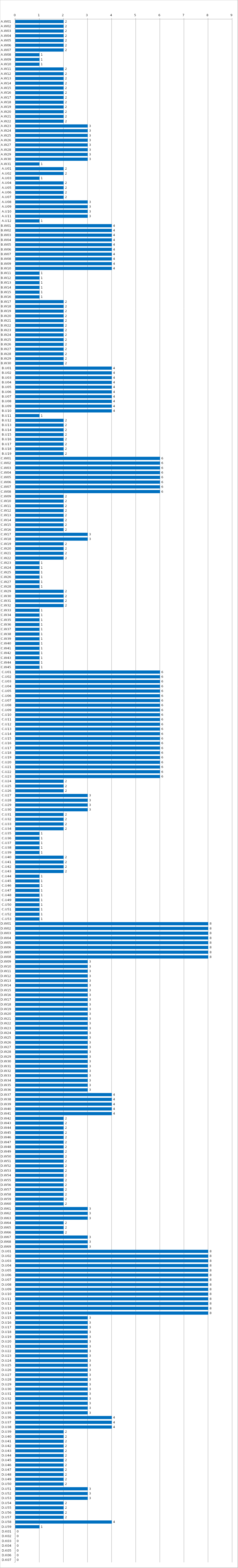
| Category | Series 0 |
|---|---|
| A.W01 | 2 |
| A.W02 | 2 |
| A.W03 | 2 |
| A.W04 | 2 |
| A.W05 | 2 |
| A.W06 | 2 |
| A.W07 | 2 |
| A.W08 | 1 |
| A.W09 | 1 |
| A.W10 | 1 |
| A.W11 | 2 |
| A.W12 | 2 |
| A.W13 | 2 |
| A.W14 | 2 |
| A.W15 | 2 |
| A.W16 | 2 |
| A.W17 | 2 |
| A.W18 | 2 |
| A.W19 | 2 |
| A.W20 | 2 |
| A.W21 | 2 |
| A.W22 | 2 |
| A.W23 | 3 |
| A.W24 | 3 |
| A.W25 | 3 |
| A.W26 | 3 |
| A.W27 | 3 |
| A.W28 | 3 |
| A.W29 | 3 |
| A.W30 | 3 |
| A.W31 | 1 |
| A.U01 | 2 |
| A.U02 | 2 |
| A.U03 | 1 |
| A.U04 | 2 |
| A.U05 | 2 |
| A.U06 | 2 |
| A.U07 | 2 |
| A.U08 | 3 |
| A.U09 | 3 |
| A.U10 | 3 |
| A.U11 | 3 |
| A.U12 | 1 |
| B.W01 | 4 |
| B.W02 | 4 |
| B.W03 | 4 |
| B.W04 | 4 |
| B.W05 | 4 |
| B.W06 | 4 |
| B.W07 | 4 |
| B.W08 | 4 |
| B.W09 | 4 |
| B.W10 | 4 |
| B.W11 | 1 |
| B.W12 | 1 |
| B.W13 | 1 |
| B.W14 | 1 |
| B.W15 | 1 |
| B.W16 | 1 |
| B.W17 | 2 |
| B.W18 | 2 |
| B.W19 | 2 |
| B.W20 | 2 |
| B.W21 | 2 |
| B.W22 | 2 |
| B.W23 | 2 |
| B.W24 | 2 |
| B.W25 | 2 |
| B.W26 | 2 |
| B.W27 | 2 |
| B.W28 | 2 |
| B.W29 | 2 |
| B.W30 | 2 |
| B.U01 | 4 |
| B.U02 | 4 |
| B.U03 | 4 |
| B.U04 | 4 |
| B.U05 | 4 |
| B.U06 | 4 |
| B.U07 | 4 |
| B.U08 | 4 |
| B.U09 | 4 |
| B.U10 | 4 |
| B.U11 | 1 |
| B.U12 | 2 |
| B.U13 | 2 |
| B.U14 | 2 |
| B.U15 | 2 |
| B.U16 | 2 |
| B.U17 | 2 |
| B.U18 | 2 |
| B.U19 | 2 |
| C.W01 | 6 |
| C.W02 | 6 |
| C.W03 | 6 |
| C.W04 | 6 |
| C.W05 | 6 |
| C.W06 | 6 |
| C.W07 | 6 |
| C.W08 | 6 |
| C.W09 | 2 |
| C.W10 | 2 |
| C.W11 | 2 |
| C.W12 | 2 |
| C.W13 | 2 |
| C.W14 | 2 |
| C.W15 | 2 |
| C.W16 | 2 |
| C.W17 | 3 |
| C.W18 | 3 |
| C.W19 | 2 |
| C.W20 | 2 |
| C.W21 | 2 |
| C.W22 | 2 |
| C.W23 | 1 |
| C.W24 | 1 |
| C.W25 | 1 |
| C.W26 | 1 |
| C.W27 | 1 |
| C.W28 | 1 |
| C.W29 | 2 |
| C.W30 | 2 |
| C.W31 | 2 |
| C.W32 | 2 |
| C.W33 | 1 |
| C.W34 | 1 |
| C.W35 | 1 |
| C.W36 | 1 |
| C.W37 | 1 |
| C.W38 | 1 |
| C.W39 | 1 |
| C.W40 | 1 |
| C.W41 | 1 |
| C.W42 | 1 |
| C.W43 | 1 |
| C.W44 | 1 |
| C.W45 | 1 |
| C.U01 | 6 |
| C.U02 | 6 |
| C.U03 | 6 |
| C.U04 | 6 |
| C.U05 | 6 |
| C.U06 | 6 |
| C.U07 | 6 |
| C.U08 | 6 |
| C.U09 | 6 |
| C.U10 | 6 |
| C.U11 | 6 |
| C.U12 | 6 |
| C.U13 | 6 |
| C.U14 | 6 |
| C.U15 | 6 |
| C.U16 | 6 |
| C.U17 | 6 |
| C.U18 | 6 |
| C.U19 | 6 |
| C.U20 | 6 |
| C.U21 | 6 |
| C.U22 | 6 |
| C.U23 | 6 |
| C.U24 | 2 |
| C.U25 | 2 |
| C.U26 | 2 |
| C.U27 | 3 |
| C.U28 | 3 |
| C.U29 | 3 |
| C.U30 | 3 |
| C.U31 | 2 |
| C.U32 | 2 |
| C.U33 | 2 |
| C.U34 | 2 |
| C.U35 | 1 |
| C.U36 | 1 |
| C.U37 | 1 |
| C.U38 | 1 |
| C.U39 | 1 |
| C.U40 | 2 |
| C.U41 | 2 |
| C.U42 | 2 |
| C.U43 | 2 |
| C.U44 | 1 |
| C.U45 | 1 |
| C.U46 | 1 |
| C.U47 | 1 |
| C.U48 | 1 |
| C.U49 | 1 |
| C.U50 | 1 |
| C.U51 | 1 |
| C.U52 | 1 |
| C.U53 | 1 |
| D.W01 | 8 |
| D.W02 | 8 |
| D.W03 | 8 |
| D.W04 | 8 |
| D.W05 | 8 |
| D.W06 | 8 |
| D.W07 | 8 |
| D.W08 | 8 |
| D.W09 | 3 |
| D.W10 | 3 |
| D.W11 | 3 |
| D.W12 | 3 |
| D.W13 | 3 |
| D.W14 | 3 |
| D.W15 | 3 |
| D.W16 | 3 |
| D.W17 | 3 |
| D.W18 | 3 |
| D.W19 | 3 |
| D.W20 | 3 |
| D.W21 | 3 |
| D.W22 | 3 |
| D.W23 | 3 |
| D.W24 | 3 |
| D.W25 | 3 |
| D.W26 | 3 |
| D.W27 | 3 |
| D.W28 | 3 |
| D.W29 | 3 |
| D.W30 | 3 |
| D.W31 | 3 |
| D.W32 | 3 |
| D.W33 | 3 |
| D.W34 | 3 |
| D.W35 | 3 |
| D.W36 | 3 |
| D.W37 | 4 |
| D.W38 | 4 |
| D.W39 | 4 |
| D.W40 | 4 |
| D.W41 | 4 |
| D.W42 | 2 |
| D.W43 | 2 |
| D.W44 | 2 |
| D.W45 | 2 |
| D.W46 | 2 |
| D.W47 | 2 |
| D.W48 | 2 |
| D.W49 | 2 |
| D.W50 | 2 |
| D.W51 | 2 |
| D.W52 | 2 |
| D.W53 | 2 |
| D.W54 | 2 |
| D.W55 | 2 |
| D.W56 | 2 |
| D.W57 | 2 |
| D.W58 | 2 |
| D.W59 | 2 |
| D.W60 | 2 |
| D.W61 | 3 |
| D.W62 | 3 |
| D.W63 | 3 |
| D.W64 | 2 |
| D.W65 | 2 |
| D.W66 | 2 |
| D.W67 | 3 |
| D.W68 | 3 |
| D.W69 | 3 |
| D.U01 | 8 |
| D.U02 | 8 |
| D.U03 | 8 |
| D.U04 | 8 |
| D.U05 | 8 |
| D.U06 | 8 |
| D.U07 | 8 |
| D.U08 | 8 |
| D.U09 | 8 |
| D.U10 | 8 |
| D.U11 | 8 |
| D.U12 | 8 |
| D.U13 | 8 |
| D.U14 | 8 |
| D.U15 | 3 |
| D.U16 | 3 |
| D.U17 | 3 |
| D.U18 | 3 |
| D.U19 | 3 |
| D.U20 | 3 |
| D.U21 | 3 |
| D.U22 | 3 |
| D.U23 | 3 |
| D.U24 | 3 |
| D.U25 | 3 |
| D.U26 | 3 |
| D.U27 | 3 |
| D.U28 | 3 |
| D.U29 | 3 |
| D.U30 | 3 |
| D.U31 | 3 |
| D.U32 | 3 |
| D.U33 | 3 |
| D.U34 | 3 |
| D.U35 | 3 |
| D.U36 | 4 |
| D.U37 | 4 |
| D.U38 | 4 |
| D.U39 | 2 |
| D.U40 | 2 |
| D.U41 | 2 |
| D.U42 | 2 |
| D.U43 | 2 |
| D.U44 | 2 |
| D.U45 | 2 |
| D.U46 | 2 |
| D.U47 | 2 |
| D.U48 | 2 |
| D.U49 | 2 |
| D.U50 | 2 |
| D.U51 | 3 |
| D.U52 | 3 |
| D.U53 | 3 |
| D.U54 | 2 |
| D.U55 | 2 |
| D.U56 | 2 |
| D.U57 | 2 |
| D.U58 | 4 |
| D.U59 | 1 |
| D.K01 | 0 |
| D.K02 | 0 |
| D.K03 | 0 |
| D.K04 | 0 |
| D.K05 | 0 |
| D.K06 | 0 |
| D.K07 | 0 |